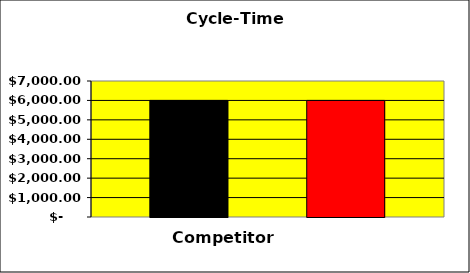
| Category | Series 0 | Series 1 | Series 2 |
|---|---|---|---|
| 0 | 6000 |  | 6000 |